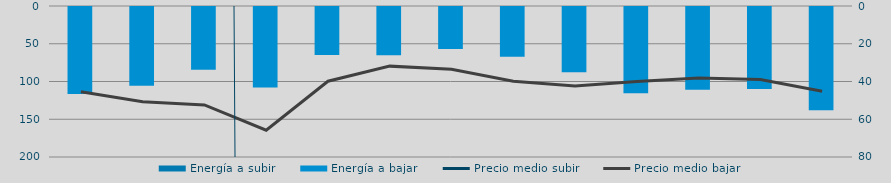
| Category | Energía a subir | Energía a bajar |
|---|---|---|
| D |  | 116442.124 |
| E |  | 105775.107 |
| F |  | 84597.136 |
| M |  | 108041.453 |
| A |  | 65058.027 |
| M |  | 65080.662 |
| J |  | 56832.525 |
| J |  | 67245.511 |
| A |  | 87837.741 |
| S |  | 115472.265 |
| O |  | 110945.08 |
| N |  | 109933.033 |
| D |  | 138127.981 |